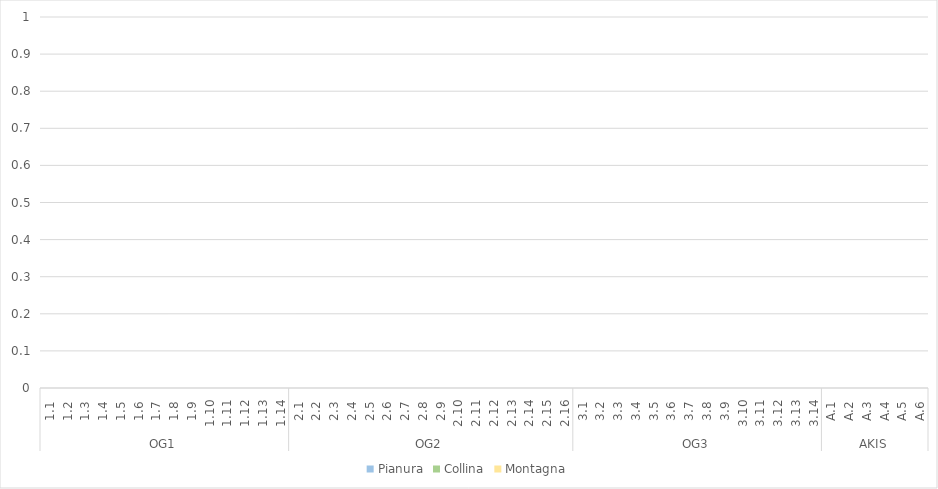
| Category | Pianura | Collina | Montagna |
|---|---|---|---|
| 0 | 0 | 0 | 0 |
| 1 | 0 | 0 | 0 |
| 2 | 0 | 0 | 0 |
| 3 | 0 | 0 | 0 |
| 4 | 0 | 0 | 0 |
| 5 | 0 | 0 | 0 |
| 6 | 0 | 0 | 0 |
| 7 | 0 | 0 | 0 |
| 8 | 0 | 0 | 0 |
| 9 | 0 | 0 | 0 |
| 10 | 0 | 0 | 0 |
| 11 | 0 | 0 | 0 |
| 12 | 0 | 0 | 0 |
| 13 | 0 | 0 | 0 |
| 14 | 0 | 0 | 0 |
| 15 | 0 | 0 | 0 |
| 16 | 0 | 0 | 0 |
| 17 | 0 | 0 | 0 |
| 18 | 0 | 0 | 0 |
| 19 | 0 | 0 | 0 |
| 20 | 0 | 0 | 0 |
| 21 | 0 | 0 | 0 |
| 22 | 0 | 0 | 0 |
| 23 | 0 | 0 | 0 |
| 24 | 0 | 0 | 0 |
| 25 | 0 | 0 | 0 |
| 26 | 0 | 0 | 0 |
| 27 | 0 | 0 | 0 |
| 28 | 0 | 0 | 0 |
| 29 | 0 | 0 | 0 |
| 30 | 0 | 0 | 0 |
| 31 | 0 | 0 | 0 |
| 32 | 0 | 0 | 0 |
| 33 | 0 | 0 | 0 |
| 34 | 0 | 0 | 0 |
| 35 | 0 | 0 | 0 |
| 36 | 0 | 0 | 0 |
| 37 | 0 | 0 | 0 |
| 38 | 0 | 0 | 0 |
| 39 | 0 | 0 | 0 |
| 40 | 0 | 0 | 0 |
| 41 | 0 | 0 | 0 |
| 42 | 0 | 0 | 0 |
| 43 | 0 | 0 | 0 |
| 44 | 0 | 0 | 0 |
| 45 | 0 | 0 | 0 |
| 46 | 0 | 0 | 0 |
| 47 | 0 | 0 | 0 |
| 48 | 0 | 0 | 0 |
| 49 | 0 | 0 | 0 |